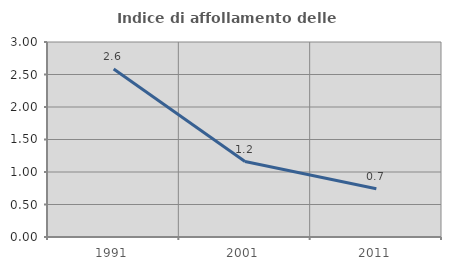
| Category | Indice di affollamento delle abitazioni  |
|---|---|
| 1991.0 | 2.584 |
| 2001.0 | 1.161 |
| 2011.0 | 0.742 |